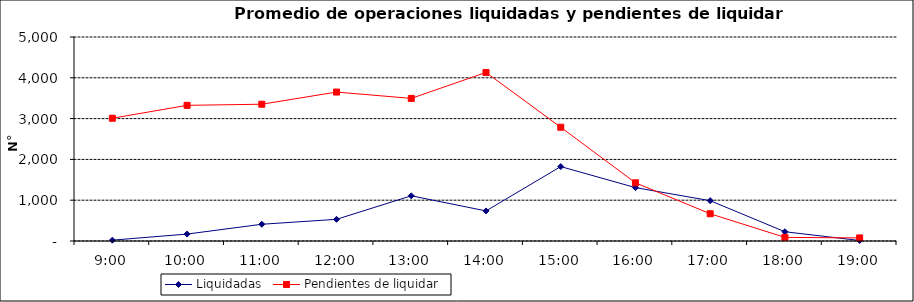
| Category | Liquidadas | Pendientes de liquidar |
|---|---|---|
| 0.375 | 20.636 | 3009 |
| 0.4166666666666667 | 169.864 | 3325.045 |
| 0.4583333333333333 | 410.455 | 3352.364 |
| 0.5 | 531.273 | 3650.5 |
| 0.5416666666666666 | 1107.591 | 3495.227 |
| 0.5833333333333334 | 737.045 | 4131.773 |
| 0.625 | 1824.136 | 2788 |
| 0.6666666666666666 | 1308.409 | 1426.409 |
| 0.7083333333333334 | 988.227 | 667.773 |
| 0.75 | 227 | 88.773 |
| 0.7916666666666666 | 12 | 75.636 |